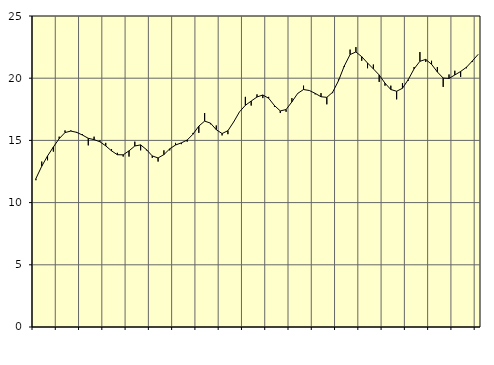
| Category | Piggar | Series 1 |
|---|---|---|
| nan | 11.8 | 11.93 |
| 1.0 | 13.3 | 12.92 |
| 1.0 | 13.4 | 13.75 |
| 1.0 | 14.1 | 14.47 |
| nan | 15.3 | 15.14 |
| 2.0 | 15.8 | 15.63 |
| 2.0 | 15.8 | 15.75 |
| 2.0 | 15.6 | 15.65 |
| nan | 15.5 | 15.43 |
| 3.0 | 14.6 | 15.17 |
| 3.0 | 15.3 | 15.06 |
| 3.0 | 15 | 14.89 |
| nan | 14.8 | 14.56 |
| 4.0 | 14.3 | 14.16 |
| 4.0 | 14 | 13.85 |
| 4.0 | 13.7 | 13.84 |
| nan | 13.7 | 14.16 |
| 5.0 | 14.9 | 14.55 |
| 5.0 | 14.2 | 14.64 |
| 5.0 | 14.2 | 14.26 |
| nan | 13.6 | 13.75 |
| 6.0 | 13.3 | 13.59 |
| 6.0 | 14.2 | 13.86 |
| 6.0 | 14.2 | 14.32 |
| nan | 14.8 | 14.63 |
| 7.0 | 14.7 | 14.8 |
| 7.0 | 14.9 | 15.03 |
| 7.0 | 15.6 | 15.5 |
| nan | 15.6 | 16.15 |
| 8.0 | 17.2 | 16.55 |
| 8.0 | 16.3 | 16.39 |
| 8.0 | 16.2 | 15.86 |
| nan | 15.4 | 15.55 |
| 9.0 | 15.5 | 15.78 |
| 9.0 | 16.5 | 16.49 |
| 9.0 | 17.3 | 17.3 |
| nan | 18.5 | 17.82 |
| 10.0 | 17.8 | 18.16 |
| 10.0 | 18.7 | 18.49 |
| 10.0 | 18.4 | 18.65 |
| nan | 18.5 | 18.39 |
| 11.0 | 17.7 | 17.8 |
| 11.0 | 17.2 | 17.37 |
| 11.0 | 17.3 | 17.48 |
| nan | 18.4 | 18.1 |
| 12.0 | 18.8 | 18.78 |
| 12.0 | 19.4 | 19.09 |
| 12.0 | 19 | 19.01 |
| nan | 18.7 | 18.78 |
| 13.0 | 18.8 | 18.51 |
| 13.0 | 17.9 | 18.46 |
| 13.0 | 18.8 | 18.87 |
| nan | 19.9 | 19.79 |
| 14.0 | 20.9 | 20.98 |
| 14.0 | 22.3 | 21.9 |
| 14.0 | 22.5 | 22.11 |
| nan | 21.4 | 21.73 |
| 15.0 | 20.8 | 21.22 |
| 15.0 | 21.1 | 20.75 |
| 15.0 | 19.7 | 20.26 |
| nan | 19.4 | 19.6 |
| 16.0 | 19.4 | 19.09 |
| 16.0 | 18.3 | 18.95 |
| 16.0 | 19.6 | 19.19 |
| nan | 19.8 | 19.89 |
| 17.0 | 20.9 | 20.75 |
| 17.0 | 22.1 | 21.36 |
| 17.0 | 21.3 | 21.51 |
| nan | 21.4 | 21.12 |
| 18.0 | 20.9 | 20.5 |
| 18.0 | 19.3 | 20.01 |
| 18.0 | 20.3 | 19.98 |
| nan | 20.6 | 20.26 |
| 19.0 | 20.1 | 20.54 |
| 19.0 | 20.8 | 20.88 |
| 19.0 | 21.3 | 21.38 |
| nan | 21.9 | 21.91 |